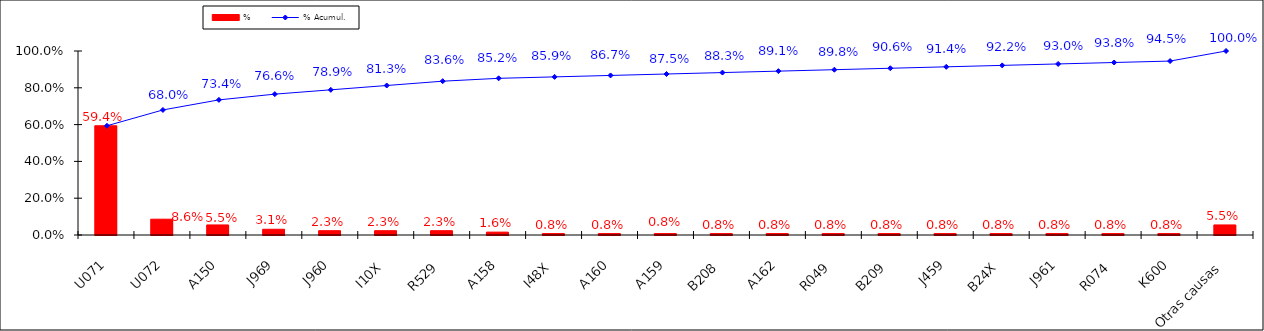
| Category | % |
|---|---|
| U071 | 0.594 |
| U072 | 0.086 |
| A150 | 0.055 |
| J969 | 0.031 |
| J960 | 0.023 |
| I10X | 0.023 |
| R529 | 0.023 |
| A158 | 0.016 |
| I48X | 0.008 |
| A160 | 0.008 |
| A159 | 0.008 |
| B208 | 0.008 |
| A162 | 0.008 |
| R049 | 0.008 |
| B209 | 0.008 |
| J459 | 0.008 |
| B24X | 0.008 |
| J961 | 0.008 |
| R074 | 0.008 |
| K600 | 0.008 |
| Otras causas | 0.055 |